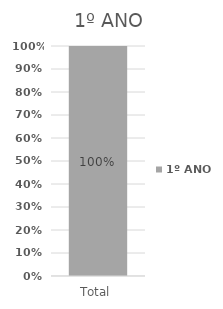
| Category | 1º ANO |
|---|---|
| Total | 1 |